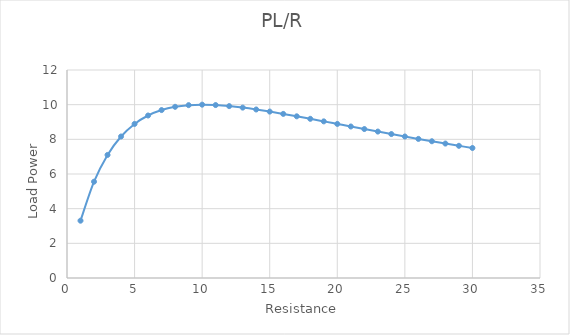
| Category | Series 0 |
|---|---|
| 1.0 | 3.306 |
| 2.0 | 5.556 |
| 3.0 | 7.101 |
| 4.0 | 8.163 |
| 5.0 | 8.889 |
| 6.0 | 9.375 |
| 7.0 | 9.689 |
| 8.0 | 9.877 |
| 9.0 | 9.972 |
| 10.0 | 10 |
| 11.0 | 9.977 |
| 12.0 | 9.917 |
| 13.0 | 9.83 |
| 14.0 | 9.722 |
| 15.0 | 9.6 |
| 16.0 | 9.467 |
| 17.0 | 9.328 |
| 18.0 | 9.184 |
| 19.0 | 9.037 |
| 20.0 | 8.889 |
| 21.0 | 8.741 |
| 22.0 | 8.594 |
| 23.0 | 8.448 |
| 24.0 | 8.304 |
| 25.0 | 8.163 |
| 26.0 | 8.025 |
| 27.0 | 7.889 |
| 28.0 | 7.756 |
| 29.0 | 7.627 |
| 30.0 | 7.5 |